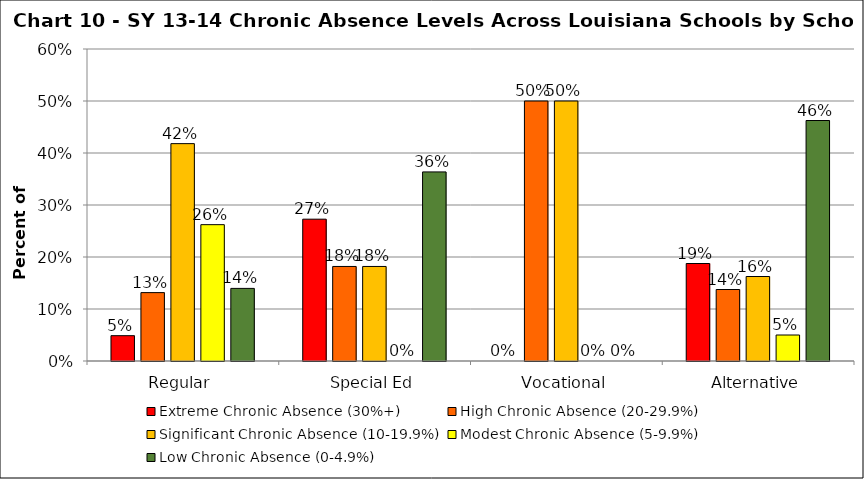
| Category | Extreme Chronic Absence (30%+) | High Chronic Absence (20-29.9%) | Significant Chronic Absence (10-19.9%) | Modest Chronic Absence (5-9.9%) | Low Chronic Absence (0-4.9%) |
|---|---|---|---|---|---|
| 0 | 0.049 | 0.131 | 0.418 | 0.262 | 0.14 |
| 1 | 0.273 | 0.182 | 0.182 | 0 | 0.364 |
| 2 | 0 | 0.5 | 0.5 | 0 | 0 |
| 3 | 0.188 | 0.138 | 0.162 | 0.05 | 0.462 |